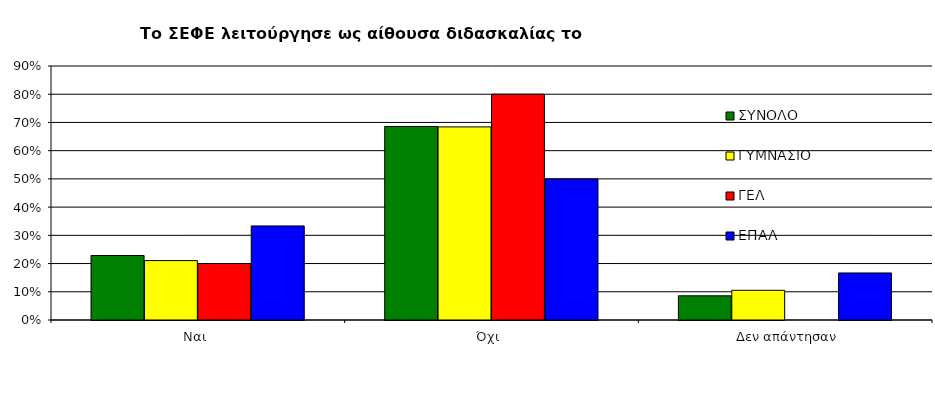
| Category | ΣΥΝΟΛΟ | ΓΥΜΝΑΣΙΟ | ΓΕΛ | ΕΠΑΛ |
|---|---|---|---|---|
| Ναι  | 0.229 | 0.211 | 0.2 | 0.333 |
| Όχι  | 0.686 | 0.684 | 0.8 | 0.5 |
|  Δεν απάντησαν | 0.086 | 0.105 | 0 | 0.167 |